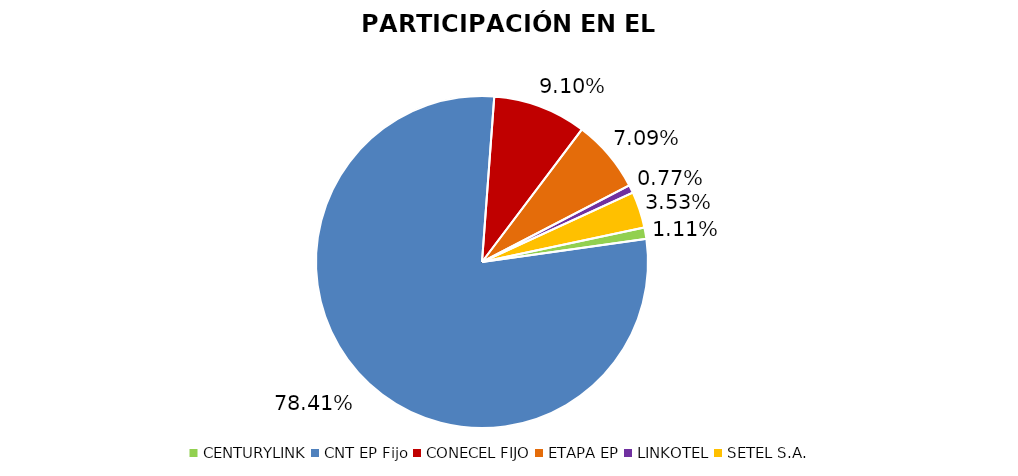
| Category | Participación en el Mercado |
|---|---|
| CENTURYLINK | 0.011 |
| CNT EP Fijo | 0.784 |
| CONECEL FIJO | 0.091 |
| ETAPA EP | 0.071 |
| LINKOTEL | 0.008 |
| SETEL S.A. | 0.035 |